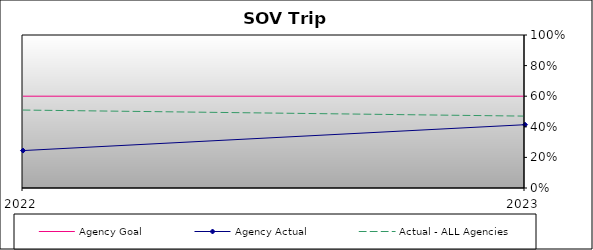
| Category | Agency Goal | Agency Actual | Actual - ALL Agencies |
|---|---|---|---|
| 2022.0 | 0.6 | 0.245 | 0.509 |
| 2023.0 | 0.6 | 0.414 | 0.47 |